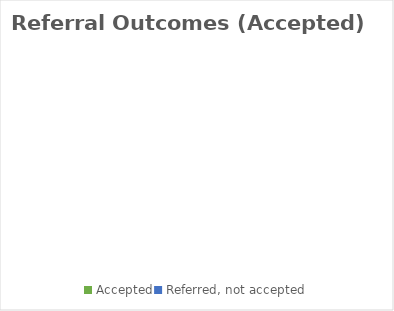
| Category | Series 0 |
|---|---|
| Accepted | 0 |
| Referred, not accepted | 0 |